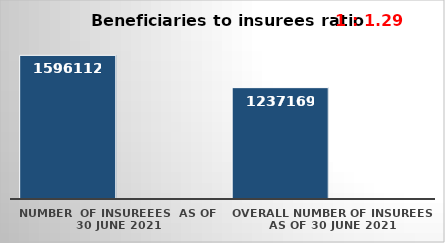
| Category | Series 0 | Series 1 |
|---|---|---|
| NUMBER  of insureees  as of  30 June 2021 | 1596112 |  |
| OVERALL number of insurees as of 30 June 2021 | 1237169 |  |